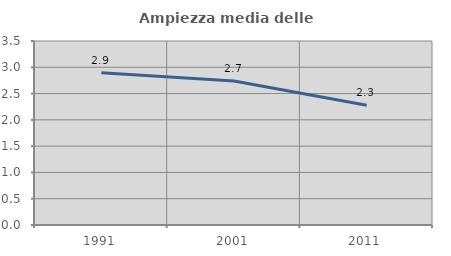
| Category | Ampiezza media delle famiglie |
|---|---|
| 1991.0 | 2.898 |
| 2001.0 | 2.739 |
| 2011.0 | 2.278 |